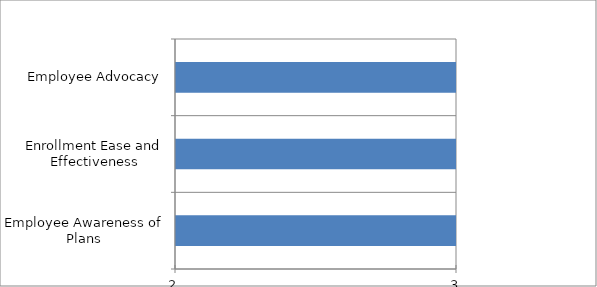
| Category | Series 0 |
|---|---|
| Employee Awareness of Plans | 3 |
| Enrollment Ease and Effectiveness | 3 |
| Employee Advocacy | 3 |